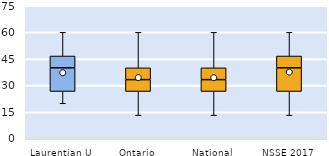
| Category | 25th | 50th | 75th |
|---|---|---|---|
| Laurentian U | 26.667 | 13.333 | 6.667 |
| Ontario | 26.667 | 6.667 | 6.667 |
| National | 26.667 | 6.667 | 6.667 |
| NSSE 2017 | 26.667 | 13.333 | 6.667 |